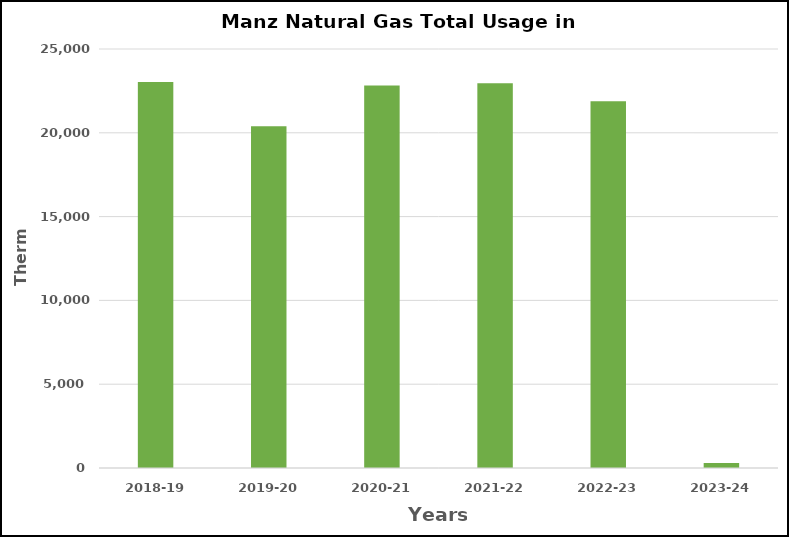
| Category | Series 0 |
|---|---|
| 2018-19 | 23027 |
| 2019-20 | 20386 |
| 2020-21 | 22829 |
| 2021-22 | 22952 |
| 2022-23 | 21881 |
| 2023-24 | 294 |